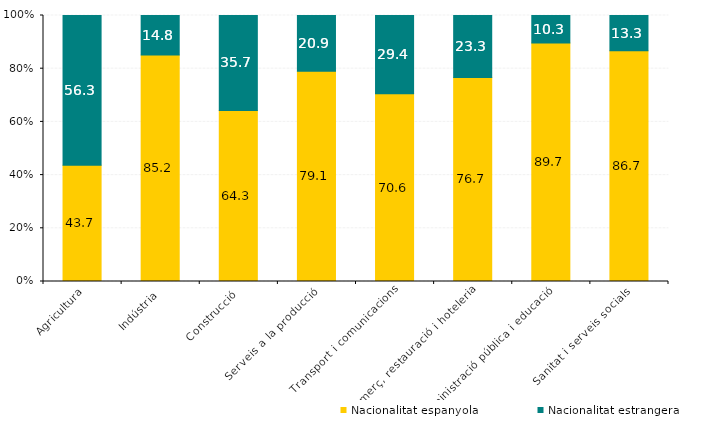
| Category | Nacionalitat espanyola | Nacionalitat estrangera |
|---|---|---|
| Agricultura | 43.716 | 56.284 |
| Indústria | 85.168 | 14.832 |
| Construcció | 64.322 | 35.678 |
| Serveis a la producció | 79.084 | 20.916 |
| Transport i comunicacions | 70.619 | 29.381 |
| Comerç, restauració i hoteleria | 76.701 | 23.299 |
| Administració pública i educació | 89.707 | 10.293 |
| Sanitat i serveis socials | 86.746 | 13.254 |